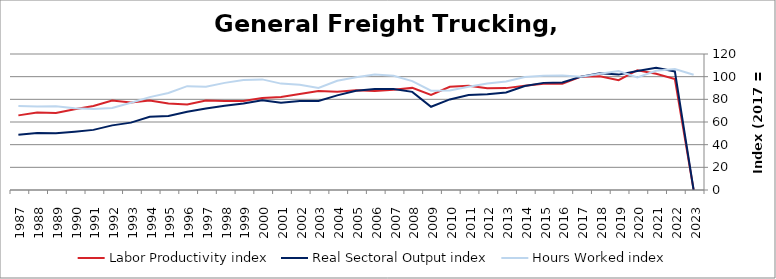
| Category | Labor Productivity index | Real Sectoral Output index | Hours Worked index |
|---|---|---|---|
| 2023.0 | 0 | 0 | 101.683 |
| 2022.0 | 97.973 | 104.643 | 106.808 |
| 2021.0 | 102.596 | 107.855 | 105.127 |
| 2020.0 | 105.721 | 104.963 | 99.283 |
| 2019.0 | 96.918 | 101.809 | 105.047 |
| 2018.0 | 100.425 | 103.007 | 102.571 |
| 2017.0 | 100 | 100 | 100 |
| 2016.0 | 93.791 | 94.848 | 101.127 |
| 2015.0 | 93.73 | 94.522 | 100.845 |
| 2014.0 | 92.008 | 91.797 | 99.77 |
| 2013.0 | 89.891 | 86.11 | 95.794 |
| 2012.0 | 89.859 | 84.45 | 93.981 |
| 2011.0 | 92.041 | 83.789 | 91.034 |
| 2010.0 | 91.042 | 79.923 | 87.787 |
| 2009.0 | 83.816 | 73.425 | 87.603 |
| 2008.0 | 90.1 | 86.58 | 96.093 |
| 2007.0 | 88.427 | 89.172 | 100.842 |
| 2006.0 | 87.419 | 89.019 | 101.83 |
| 2005.0 | 87.968 | 87.573 | 99.55 |
| 2004.0 | 86.655 | 83.483 | 96.339 |
| 2003.0 | 87.263 | 78.543 | 90.008 |
| 2002.0 | 84.642 | 78.594 | 92.854 |
| 2001.0 | 82.112 | 77.084 | 93.877 |
| 2000.0 | 81.231 | 79.283 | 97.602 |
| 1999.0 | 78.602 | 76.269 | 97.032 |
| 1998.0 | 78.595 | 74.287 | 94.519 |
| 1997.0 | 78.986 | 72.007 | 91.164 |
| 1996.0 | 75.384 | 69.056 | 91.606 |
| 1995.0 | 76.278 | 65.298 | 85.605 |
| 1994.0 | 78.939 | 64.675 | 81.931 |
| 1993.0 | 77.141 | 59.443 | 77.058 |
| 1992.0 | 78.856 | 57.034 | 72.328 |
| 1991.0 | 74.197 | 53.046 | 71.493 |
| 1990.0 | 71.341 | 51.436 | 72.099 |
| 1989.0 | 67.9 | 50.107 | 73.795 |
| 1988.0 | 68.444 | 50.4 | 73.637 |
| 1987.0 | 65.843 | 48.837 | 74.173 |